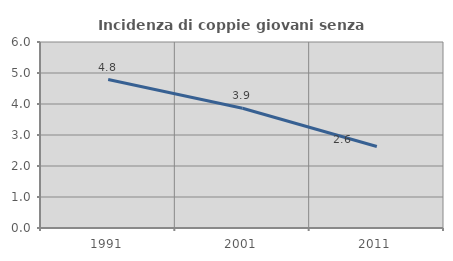
| Category | Incidenza di coppie giovani senza figli |
|---|---|
| 1991.0 | 4.789 |
| 2001.0 | 3.863 |
| 2011.0 | 2.63 |